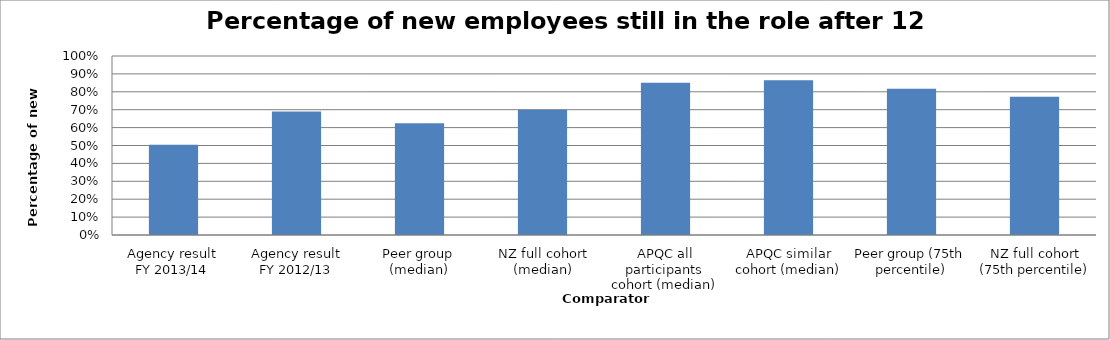
| Category | Result |
|---|---|
| Agency result
FY 2013/14 | 0.504 |
| Agency result
FY 2012/13 | 0.69 |
| Peer group (median) | 0.625 |
| NZ full cohort (median) | 0.7 |
| APQC all participants cohort (median) | 0.85 |
| APQC similar cohort (median) | 0.865 |
| Peer group (75th percentile) | 0.818 |
| NZ full cohort (75th percentile) | 0.772 |